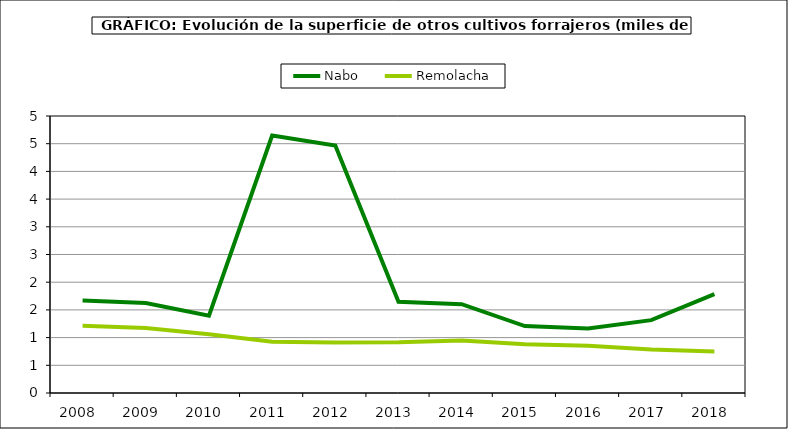
| Category | Nabo | Remolacha |
|---|---|---|
| 2008.0 | 1.67 | 1.212 |
| 2009.0 | 1.623 | 1.175 |
| 2010.0 | 1.395 | 1.06 |
| 2011.0 | 4.647 | 0.925 |
| 2012.0 | 4.467 | 0.913 |
| 2013.0 | 1.647 | 0.917 |
| 2014.0 | 1.603 | 0.949 |
| 2015.0 | 1.208 | 0.881 |
| 2016.0 | 1.165 | 0.854 |
| 2017.0 | 1.315 | 0.786 |
| 2018.0 | 1.784 | 0.748 |